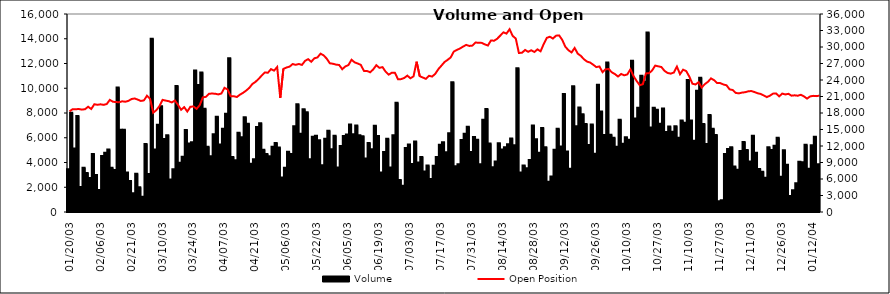
| Category | Volume  |
|---|---|
| 2003-01-20 | 3449 |
| 2003-01-21 | 8015 |
| 2003-01-22 | 5122 |
| 2003-01-23 | 7748 |
| 2003-01-24 | 2020 |
| 2003-01-27 | 3574 |
| 2003-01-28 | 3147 |
| 2003-01-29 | 2749 |
| 2003-01-30 | 4683 |
| 2003-02-05 | 2992 |
| 2003-02-06 | 1774 |
| 2003-02-07 | 4517 |
| 2003-02-10 | 4785 |
| 2003-02-11 | 5041 |
| 2003-02-13 | 3572 |
| 2003-02-14 | 3404 |
| 2003-02-17 | 10055 |
| 2003-02-18 | 6644 |
| 2003-02-19 | 6642 |
| 2003-02-20 | 3197 |
| 2003-02-21 | 2496 |
| 2003-02-24 | 1525 |
| 2003-02-25 | 3100 |
| 2003-02-26 | 1996 |
| 2003-02-27 | 1234 |
| 2003-02-28 | 5488 |
| 2003-03-03 | 3064 |
| 2003-03-05 | 14003 |
| 2003-03-06 | 5060 |
| 2003-03-07 | 7056 |
| 2003-03-10 | 8538 |
| 2003-03-11 | 5906 |
| 2003-03-12 | 6204 |
| 2003-03-13 | 2633 |
| 2003-03-14 | 3448 |
| 2003-03-17 | 10175 |
| 2003-03-18 | 3984 |
| 2003-03-19 | 4468 |
| 2003-03-20 | 6635 |
| 2003-03-21 | 5527 |
| 2003-03-24 | 5643 |
| 2003-03-25 | 11438 |
| 2003-03-26 | 10258 |
| 2003-03-27 | 11280 |
| 2003-03-28 | 8350 |
| 2003-03-31 | 5268 |
| 2003-04-01 | 4501 |
| 2003-04-02 | 6277 |
| 2003-04-03 | 7705 |
| 2003-04-04 | 5455 |
| 2003-04-07 | 6729 |
| 2003-04-08 | 7934 |
| 2003-04-09 | 12426 |
| 2003-04-10 | 4444 |
| 2003-04-11 | 4188 |
| 2003-04-14 | 6412 |
| 2003-04-15 | 6044 |
| 2003-04-16 | 7655 |
| 2003-04-17 | 7140 |
| 2003-04-18 | 3898 |
| 2003-04-21 | 4272 |
| 2003-04-22 | 6865 |
| 2003-04-23 | 7169 |
| 2003-04-24 | 5024 |
| 2003-04-25 | 4687 |
| 2003-04-28 | 4507 |
| 2003-04-29 | 5279 |
| 2003-04-30 | 5573 |
| 2003-05-02 | 5208 |
| 2003-05-05 | 2795 |
| 2003-05-06 | 3566 |
| 2003-05-07 | 4861 |
| 2003-05-08 | 4681 |
| 2003-05-09 | 6932 |
| 2003-05-12 | 8698 |
| 2003-05-13 | 6325 |
| 2003-05-16 | 8296 |
| 2003-05-19 | 8052 |
| 2003-05-20 | 4257 |
| 2003-05-21 | 6078 |
| 2003-05-22 | 6170 |
| 2003-05-23 | 5797 |
| 2003-05-26 | 3784 |
| 2003-05-27 | 5921 |
| 2003-05-28 | 6575 |
| 2003-05-29 | 5075 |
| 2003-05-30 | 6154 |
| 2003-06-02 | 3592 |
| 2003-06-03 | 5336 |
| 2003-06-04 | 6147 |
| 2003-06-05 | 6260 |
| 2003-06-06 | 7066 |
| 2003-06-09 | 6289 |
| 2003-06-10 | 6993 |
| 2003-06-11 | 6194 |
| 2003-06-12 | 6130 |
| 2003-06-13 | 4326 |
| 2003-06-16 | 5573 |
| 2003-06-17 | 5079 |
| 2003-06-18 | 6964 |
| 2003-06-19 | 6139 |
| 2003-06-20 | 3183 |
| 2003-06-23 | 4852 |
| 2003-06-24 | 5910 |
| 2003-06-25 | 3594 |
| 2003-06-26 | 6194 |
| 2003-06-27 | 8823 |
| 2003-06-30 | 2587 |
| 2003-07-01 | 2122 |
| 2003-07-02 | 5174 |
| 2003-07-03 | 5463 |
| 2003-07-04 | 3870 |
| 2003-07-07 | 5693 |
| 2003-07-08 | 4000 |
| 2003-07-09 | 4444 |
| 2003-07-10 | 3265 |
| 2003-07-11 | 3753 |
| 2003-07-14 | 2658 |
| 2003-07-15 | 3735 |
| 2003-07-16 | 4445 |
| 2003-07-17 | 5433 |
| 2003-07-18 | 5641 |
| 2003-07-21 | 4823 |
| 2003-07-22 | 6365 |
| 2003-07-23 | 10482 |
| 2003-07-24 | 3690 |
| 2003-07-25 | 3851 |
| 2003-07-28 | 5826 |
| 2003-07-29 | 6322 |
| 2003-07-30 | 6880 |
| 2003-07-31 | 4855 |
| 2003-08-01 | 6067 |
| 2003-08-04 | 5848 |
| 2003-08-05 | 3860 |
| 2003-08-06 | 7454 |
| 2003-08-07 | 8326 |
| 2003-08-08 | 5531 |
| 2003-08-11 | 3618 |
| 2003-08-12 | 4079 |
| 2003-08-13 | 5556 |
| 2003-08-14 | 5049 |
| 2003-08-15 | 5223 |
| 2003-08-18 | 5484 |
| 2003-08-19 | 5949 |
| 2003-08-20 | 5402 |
| 2003-08-21 | 11610 |
| 2003-08-22 | 3193 |
| 2003-08-25 | 3767 |
| 2003-08-26 | 3543 |
| 2003-08-27 | 4210 |
| 2003-08-28 | 6988 |
| 2003-08-29 | 5887 |
| 2003-09-02 | 4787 |
| 2003-09-03 | 6780 |
| 2003-09-04 | 5240 |
| 2003-09-05 | 2447 |
| 2003-09-08 | 2872 |
| 2003-09-09 | 5021 |
| 2003-09-10 | 6718 |
| 2003-09-11 | 5288 |
| 2003-09-12 | 9533 |
| 2003-09-15 | 4879 |
| 2003-09-16 | 3494 |
| 2003-09-17 | 10162 |
| 2003-09-18 | 6928 |
| 2003-09-19 | 8451 |
| 2003-09-22 | 7897 |
| 2003-09-23 | 7115 |
| 2003-09-24 | 5414 |
| 2003-09-25 | 7064 |
| 2003-09-26 | 4715 |
| 2003-09-29 | 10288 |
| 2003-09-30 | 8112 |
| 2003-10-01 | 6225 |
| 2003-10-02 | 12076 |
| 2003-10-03 | 6240 |
| 2003-10-06 | 5995 |
| 2003-10-07 | 5264 |
| 2003-10-08 | 7459 |
| 2003-10-09 | 5525 |
| 2003-10-10 | 6035 |
| 2003-10-13 | 5837 |
| 2003-10-14 | 12225 |
| 2003-10-15 | 7557 |
| 2003-10-16 | 8432 |
| 2003-10-17 | 11015 |
| 2003-10-20 | 10526 |
| 2003-10-21 | 14508 |
| 2003-10-22 | 6832 |
| 2003-10-23 | 8426 |
| 2003-10-27 | 8264 |
| 2003-10-28 | 7141 |
| 2003-10-29 | 8361 |
| 2003-10-30 | 6464 |
| 2003-10-31 | 6914 |
| 2003-11-03 | 6482 |
| 2003-11-04 | 6935 |
| 2003-11-05 | 6002 |
| 2003-11-06 | 7384 |
| 2003-11-07 | 7220 |
| 2003-11-10 | 10674 |
| 2003-11-11 | 7395 |
| 2003-11-12 | 5760 |
| 2003-11-13 | 9804 |
| 2003-11-14 | 10844 |
| 2003-11-17 | 7108 |
| 2003-11-18 | 5503 |
| 2003-11-19 | 7829 |
| 2003-11-20 | 6731 |
| 2003-11-21 | 6215 |
| 2003-11-27 | 862 |
| 2003-11-28 | 947 |
| 2003-12-01 | 4682 |
| 2003-12-02 | 5090 |
| 2003-12-03 | 5233 |
| 2003-12-04 | 3675 |
| 2003-12-05 | 3409 |
| 2003-12-08 | 4934 |
| 2003-12-09 | 5656 |
| 2003-12-10 | 5017 |
| 2003-12-11 | 4080 |
| 2003-12-12 | 6157 |
| 2003-12-15 | 4797 |
| 2003-12-16 | 3484 |
| 2003-12-17 | 3262 |
| 2003-12-18 | 2770 |
| 2003-12-19 | 5237 |
| 2003-12-22 | 5011 |
| 2003-12-23 | 5346 |
| 2003-12-24 | 5991 |
| 2003-12-26 | 2849 |
| 2003-12-29 | 4981 |
| 2003-12-30 | 3809 |
| 2003-12-31 | 1294 |
| 2004-01-02 | 1766 |
| 2004-01-05 | 2319 |
| 2004-01-06 | 4067 |
| 2004-01-07 | 4017 |
| 2004-01-08 | 5429 |
| 2004-01-09 | 3500 |
| 2004-01-12 | 5385 |
| 2004-01-13 | 6086 |
| 2004-01-14 | 3867 |